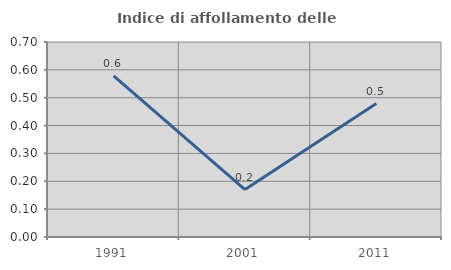
| Category | Indice di affollamento delle abitazioni  |
|---|---|
| 1991.0 | 0.578 |
| 2001.0 | 0.17 |
| 2011.0 | 0.479 |